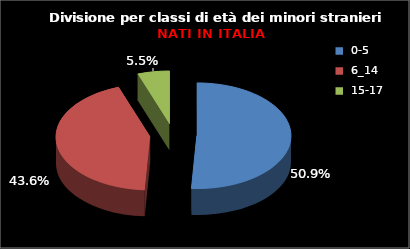
| Category | Series 0 |
|---|---|
| 0-5 | 140 |
| 6_14 | 120 |
| 15-17 | 15 |